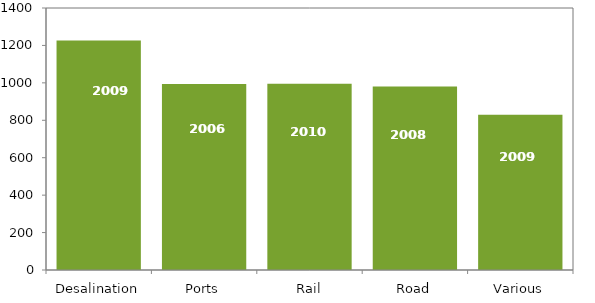
| Category | Average wage rate |
|---|---|
| Desalination | 1226.05 |
| Ports | 994.5 |
| Rail | 994.698 |
| Road | 979.888 |
| Various | 829.453 |